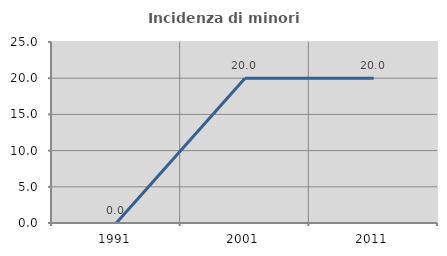
| Category | Incidenza di minori stranieri |
|---|---|
| 1991.0 | 0 |
| 2001.0 | 20 |
| 2011.0 | 20 |